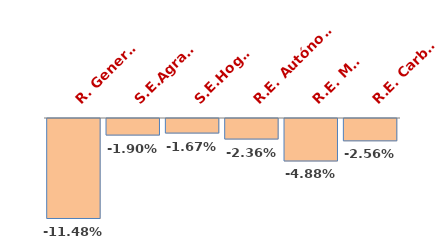
| Category | Series 0 |
|---|---|
| R. General | -0.115 |
| S.E.Agrario | -0.019 |
| S.E.Hogar | -0.017 |
| R.E. Autónomos | -0.024 |
| R.E. Mar | -0.049 |
| R.E. Carbón | -0.026 |